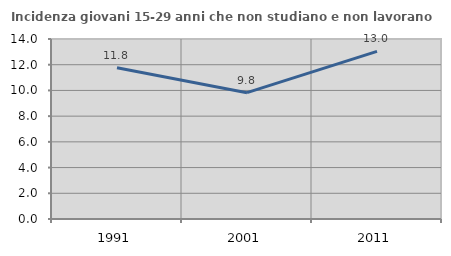
| Category | Incidenza giovani 15-29 anni che non studiano e non lavorano  |
|---|---|
| 1991.0 | 11.762 |
| 2001.0 | 9.826 |
| 2011.0 | 13.042 |